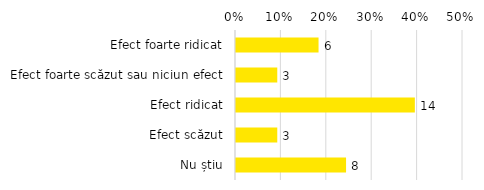
| Category | Total |
|---|---|
| Efect foarte ridicat | 0.182 |
| Efect foarte scăzut sau niciun efect | 0.091 |
| Efect ridicat | 0.394 |
| Efect scăzut | 0.091 |
| Nu știu | 0.242 |